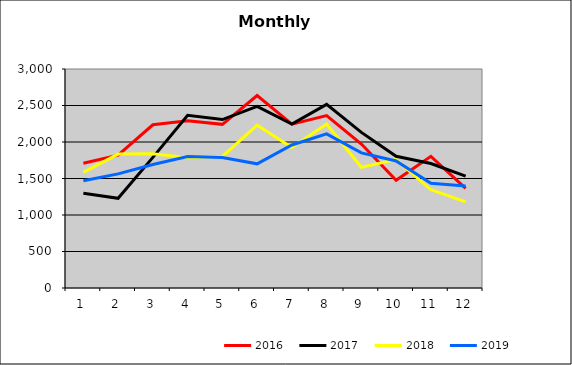
| Category | 2016 | 2017 | 2018 | 2019 |
|---|---|---|---|---|
| 0 | 1709.692 | 1297.347 | 1584.945 | 1467.961 |
| 1 | 1818.591 | 1228.546 | 1834.566 | 1563.301 |
| 2 | 2235.971 | 1789.782 | 1838.878 | 1692.17 |
| 3 | 2290.052 | 2364.914 | 1785.082 | 1799.954 |
| 4 | 2241.602 | 2307.576 | 1801.761 | 1787.008 |
| 5 | 2636.687 | 2488.575 | 2229.629 | 1700.928 |
| 6 | 2245.31 | 2244.746 | 1923.685 | 1959.132 |
| 7 | 2362.2 | 2515.952 | 2246.519 | 2111.404 |
| 8 | 1971.49 | 2131.972 | 1654.017 | 1851.294 |
| 9 | 1477.1 | 1804.009 | 1760.102 | 1740.445 |
| 10 | 1802.993 | 1705.861 | 1345.712 | 1434.409 |
| 11 | 1366.089 | 1533.212 | 1179.594 | 1396.753 |